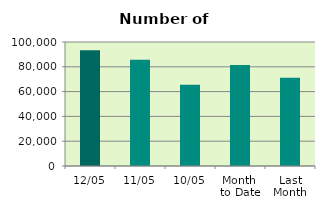
| Category | Series 0 |
|---|---|
| 12/05 | 93330 |
| 11/05 | 85612 |
| 10/05 | 65610 |
| Month 
to Date | 81372.857 |
| Last
Month | 71251.4 |